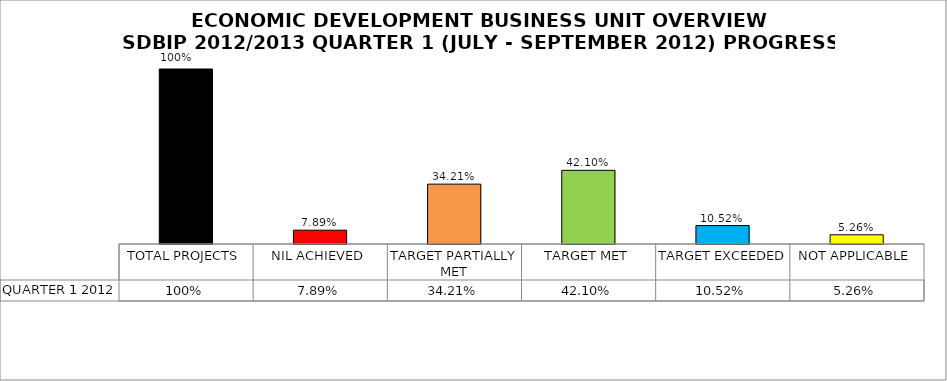
| Category | QUARTER 1 2012 |
|---|---|
| TOTAL PROJECTS | 1 |
| NIL ACHIEVED | 0.079 |
| TARGET PARTIALLY MET | 0.342 |
| TARGET MET | 0.421 |
| TARGET EXCEEDED | 0.105 |
| NOT APPLICABLE | 0.053 |